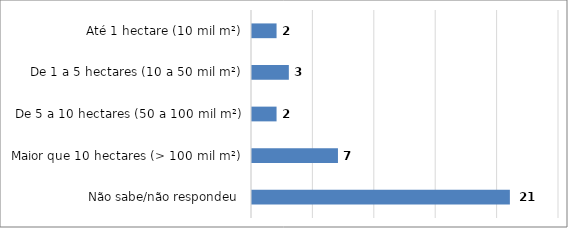
| Category | Series 0 |
|---|---|
| Não sabe/não respondeu | 21 |
| Maior que 10 hectares (> 100 mil m²) | 7 |
| De 5 a 10 hectares (50 a 100 mil m²) | 2 |
| De 1 a 5 hectares (10 a 50 mil m²) | 3 |
| Até 1 hectare (10 mil m²) | 2 |